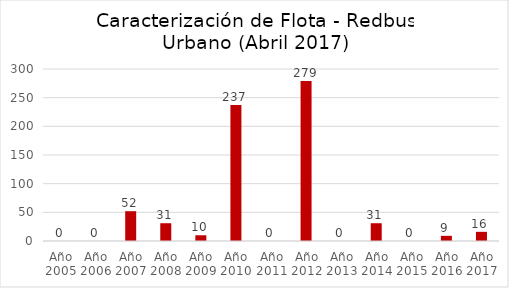
| Category | Series 0 |
|---|---|
| Año 2005 | 0 |
| Año 2006 | 0 |
| Año 2007 | 52 |
| Año 2008 | 31 |
| Año 2009 | 10 |
| Año 2010 | 237 |
| Año 2011 | 0 |
| Año 2012 | 279 |
| Año 2013 | 0 |
| Año 2014 | 31 |
| Año 2015 | 0 |
| Año 2016 | 9 |
| Año 2017 | 16 |